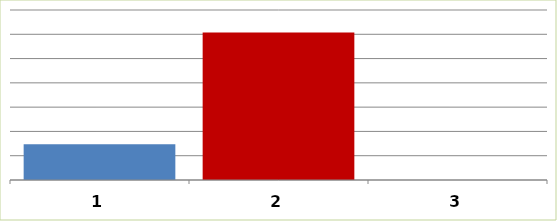
| Category | Series 0 |
|---|---|
| 0 | 29339252 |
| 1 | 121455935 |
| 2 | 0 |